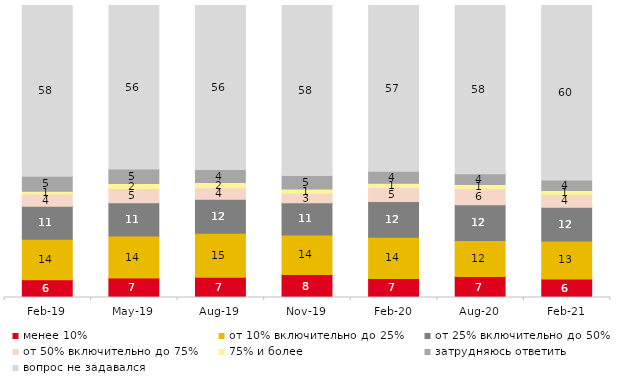
| Category | менее 10% | от 10% включительно до 25% | от 25% включительно до 50% | от 50% включительно до 75% | 75% и более | затрудняюсь ответить | вопрос не задавался |
|---|---|---|---|---|---|---|---|
| 2019-02-01 | 6.1 | 13.85 | 11.3 | 4.2 | 0.95 | 5.15 | 58.45 |
| 2019-05-01 | 6.686 | 14.364 | 11.392 | 4.854 | 1.734 | 5.002 | 55.968 |
| 2019-08-01 | 6.893 | 15.135 | 11.638 | 3.946 | 1.748 | 4.496 | 56.144 |
| 2019-11-01 | 7.871 | 13.515 | 11.04 | 3.267 | 1.485 | 4.604 | 58.218 |
| 2020-02-01 | 6.535 | 14.059 | 12.277 | 4.802 | 1.485 | 4.059 | 56.782 |
| 2020-08-01 | 7.15 | 12.413 | 12.165 | 5.511 | 1.49 | 3.674 | 57.597 |
| 2021-02-01 | 6.352 | 13.002 | 11.563 | 4.318 | 1.439 | 3.573 | 59.752 |